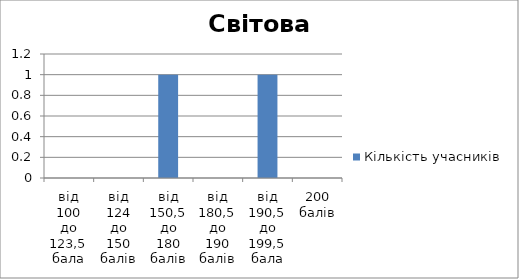
| Category | Кількість учасників |
|---|---|
| від 100 до 123,5 бала | 0 |
| від 124 до 150 балів | 0 |
| від 150,5 до 180 балів | 1 |
| від 180,5 до 190 балів | 0 |
| від 190,5 до 199,5 бала | 1 |
| 200 балів | 0 |